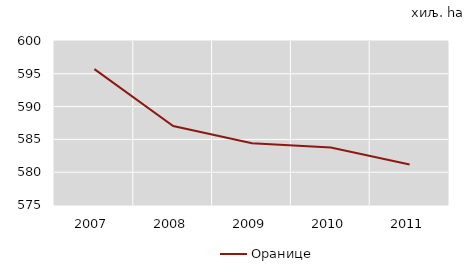
| Category | Оранице |
|---|---|
| 2007.0 | 595.708 |
| 2008.0 | 587.039 |
| 2009.0 | 584.406 |
| 2010.0 | 583.755 |
| 2011.0 | 581.179 |